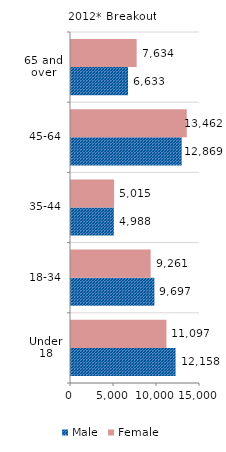
| Category | Male | Female |
|---|---|---|
| Under 18 | 9359 | 9429 |
| 18-34 | 16428 | 13733 |
| 35-44 | 5996 | 5239 |
| 45-64 | 10949 | 10601 |
| 65 and over | 3984 | 4621 |